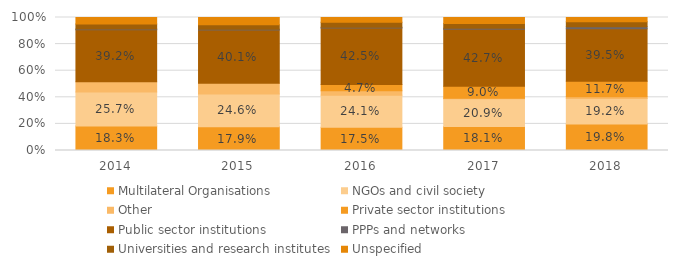
| Category | Multilateral Organisations | NGOs and civil society | Other | Private sector institutions | Public sector institutions | PPPs and networks | Universities and research institutes | Unspecified |
|---|---|---|---|---|---|---|---|---|
| 2014.0 | 0.183 | 0.257 | 0.076 | 0 | 0.392 | 0.006 | 0.037 | 0.049 |
| 2015.0 | 0.179 | 0.246 | 0.08 | 0 | 0.401 | 0.007 | 0.033 | 0.054 |
| 2016.0 | 0.175 | 0.241 | 0.034 | 0.047 | 0.425 | 0.005 | 0.037 | 0.037 |
| 2017.0 | 0.181 | 0.209 | 0.005 | 0.09 | 0.427 | 0.008 | 0.035 | 0.045 |
| 2018.0 | 0.198 | 0.192 | 0.014 | 0.117 | 0.395 | 0.014 | 0.039 | 0.031 |